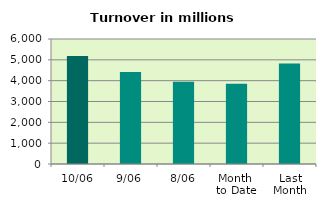
| Category | Series 0 |
|---|---|
| 10/06 | 5182.341 |
| 9/06 | 4418.932 |
| 8/06 | 3949.028 |
| Month 
to Date | 3850.872 |
| Last
Month | 4818.103 |